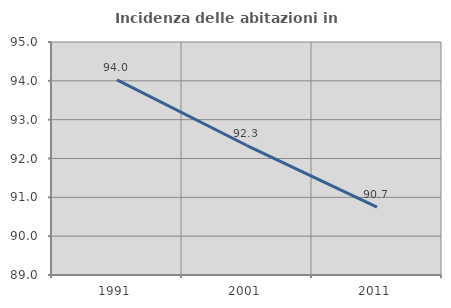
| Category | Incidenza delle abitazioni in proprietà  |
|---|---|
| 1991.0 | 94.023 |
| 2001.0 | 92.334 |
| 2011.0 | 90.747 |